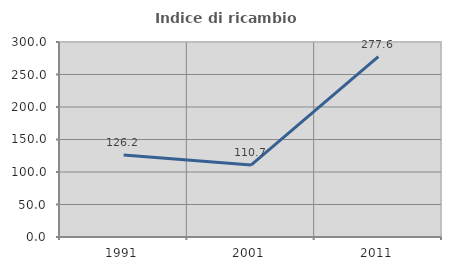
| Category | Indice di ricambio occupazionale  |
|---|---|
| 1991.0 | 126.186 |
| 2001.0 | 110.714 |
| 2011.0 | 277.596 |